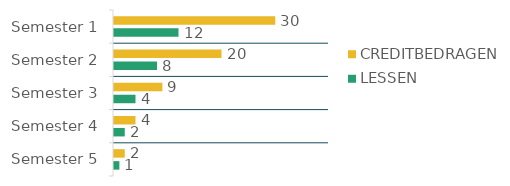
| Category | CREDITBEDRAGEN  | LESSEN  |
|---|---|---|
| Semester 1 | 30 | 12 |
| Semester 2 | 20 | 8 |
| Semester 3 | 9 | 4 |
| Semester 4 | 4 | 2 |
| Semester 5 | 2 | 1 |